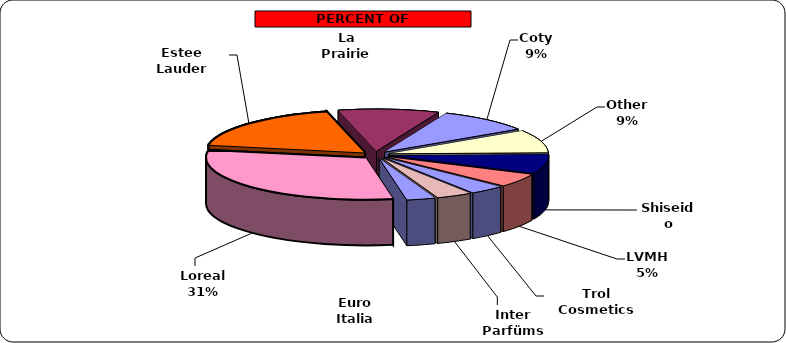
| Category | Series 0 |
|---|---|
| Loreal | 42 |
| Estee Lauder | 25 |
| La Prairie | 14 |
| Coty | 13 |
| Other | 12 |
| Shiseido | 10 |
| LVMH | 7 |
| Trol Cosmetics | 5 |
| Inter Parfüms | 5 |
| Euro Italia | 4 |